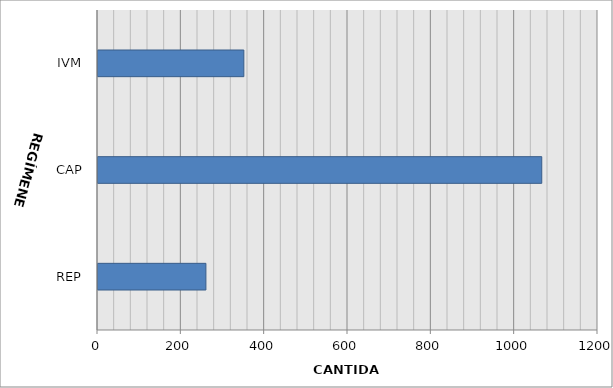
| Category | Series 0 |
|---|---|
| REP | 259 |
| CAP | 1065 |
| IVM | 350 |